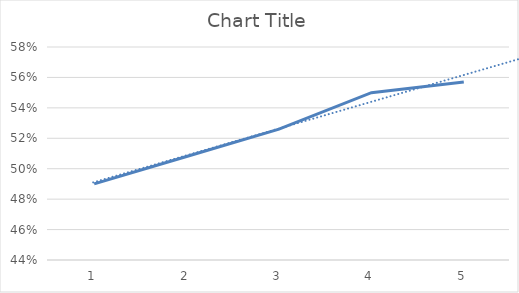
| Category | Series 0 |
|---|---|
| 0 | 0.49 |
| 1 | 0.508 |
| 2 | 0.526 |
| 3 | 0.55 |
| 4 | 0.557 |